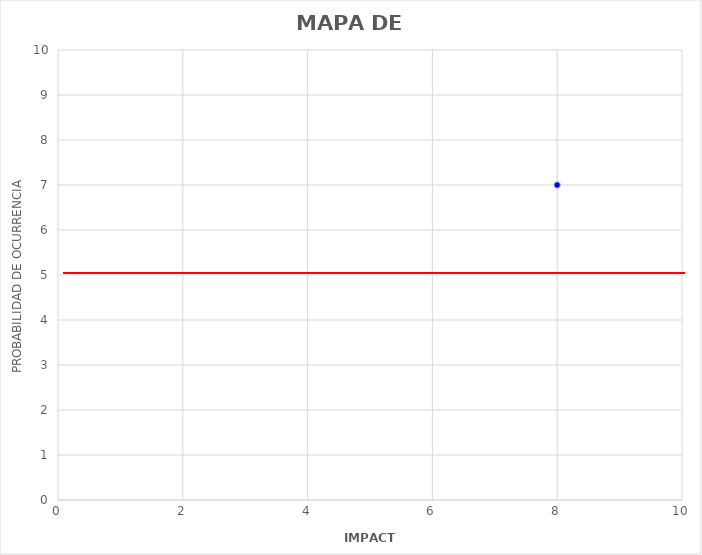
| Category | iMPACTO |
|---|---|
| 8.0 | 7 |